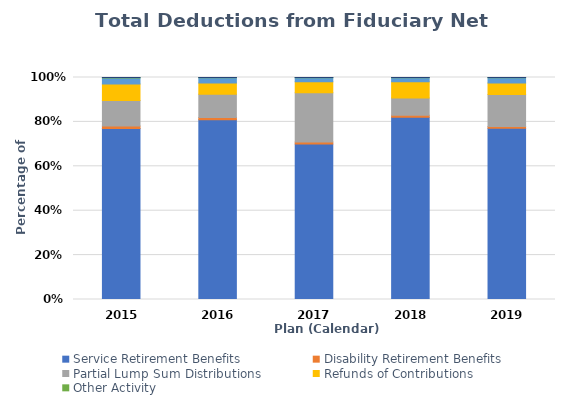
| Category | Service Retirement Benefits | Disability Retirement Benefits | Partial Lump Sum Distributions | Refunds of Contributions | Administrative Expenses | Other Activity | Year |
|---|---|---|---|---|---|---|---|
| 2015.0 | 4355846 | 66362 | 646853 | 424391 | 154001 | 7606 | 2015 |
| 2016.0 | 4735234 | 64227 | 607903 | 299044 | 135695 | 7311 | 2016 |
| 2017.0 | 5348180 | 64314 | 1694536 | 376465 | 140808 | 7136 | 2017 |
| 2018.0 | 5936944 | 65029 | 561852 | 525648 | 132486 | 6922 | 2018 |
| 2019.0 | 6599082 | 66030 | 1232587 | 450098 | 199971 | 6007 | 2019 |